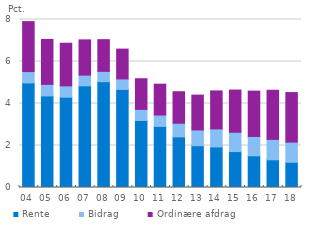
| Category | Rente | Bidrag | Ordinære afdrag |
|---|---|---|---|
| 04 | 4.98 | 0.54 | 2.38 |
| 05 | 4.36 | 0.55 | 2.14 |
| 06 | 4.3 | 0.54 | 2.03 |
| 07 | 4.84 | 0.51 | 1.68 |
| 08 | 5.04 | 0.49 | 1.51 |
| 09 | 4.67 | 0.5 | 1.42 |
| 10 | 3.19 | 0.53 | 1.46 |
| 11 | 2.91 | 0.54 | 1.47 |
| 12 | 2.41 | 0.65 | 1.5 |
| 13 | 1.99 | 0.75 | 1.66 |
| 14 | 1.93 | 0.86 | 1.81 |
| 15 | 1.71 | 0.92 | 2.01 |
| 16 | 1.51 | 0.92 | 2.16 |
| 17 | 1.32 | 0.97 | 2.34 |
| 18 | 1.2 | 0.96 | 2.36 |